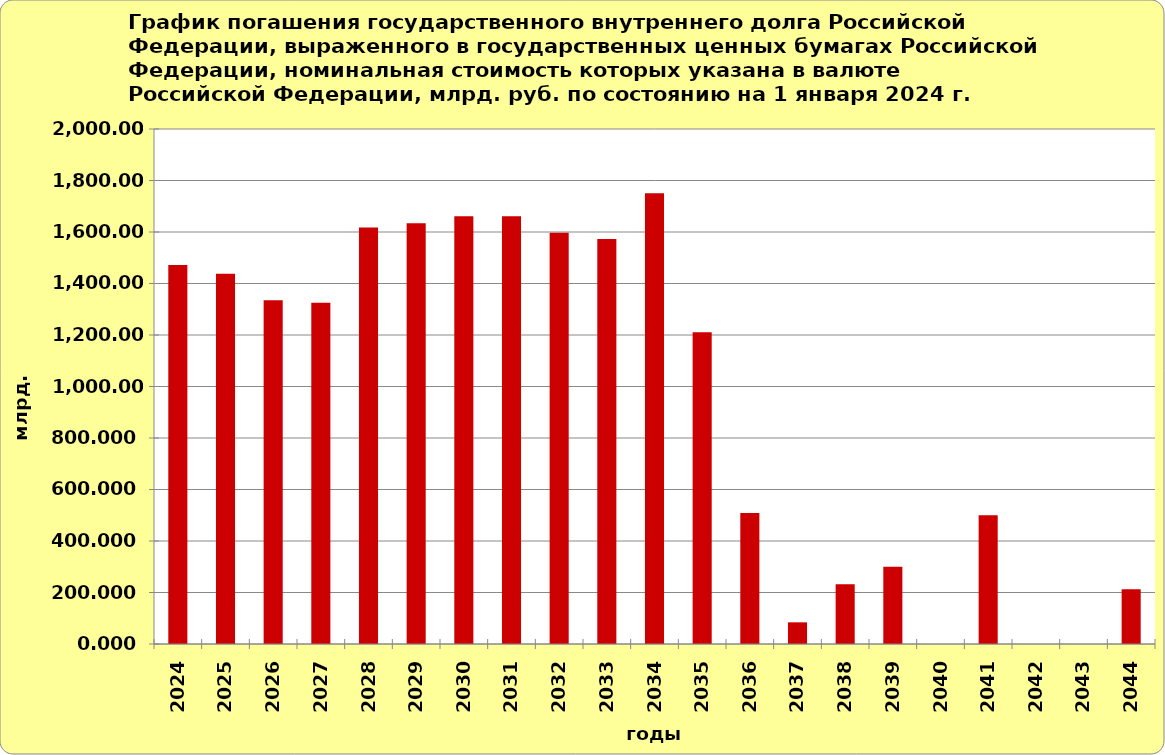
| Category | Series 1 |
|---|---|
| 2024.0 | 1471.76 |
| 2025.0 | 1437.645 |
| 2026.0 | 1334.561 |
| 2027.0 | 1324.833 |
| 2028.0 | 1617.838 |
| 2029.0 | 1633.774 |
| 2030.0 | 1661.568 |
| 2031.0 | 1661.564 |
| 2032.0 | 1596.929 |
| 2033.0 | 1572.996 |
| 2034.0 | 1750.779 |
| 2035.0 | 1210.91 |
| 2036.0 | 508.553 |
| 2037.0 | 84.139 |
| 2038.0 | 231.875 |
| 2039.0 | 300 |
| 2040.0 | 0 |
| 2041.0 | 500 |
| 2042.0 | 0 |
| 2043.0 | 0 |
| 2044.0 | 212.636 |